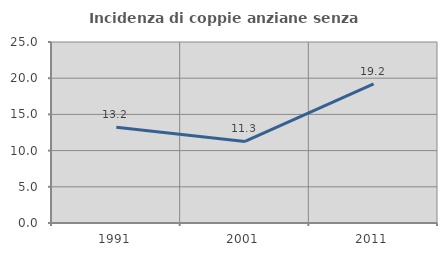
| Category | Incidenza di coppie anziane senza figli  |
|---|---|
| 1991.0 | 13.235 |
| 2001.0 | 11.258 |
| 2011.0 | 19.231 |